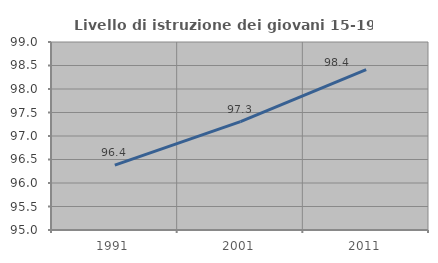
| Category | Livello di istruzione dei giovani 15-19 anni |
|---|---|
| 1991.0 | 96.382 |
| 2001.0 | 97.307 |
| 2011.0 | 98.412 |